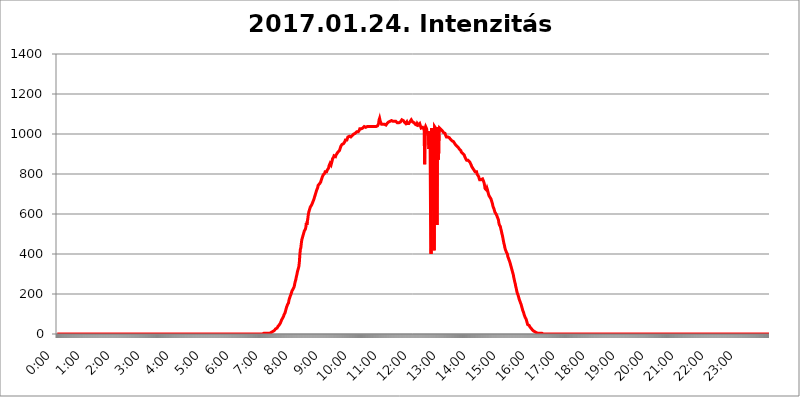
| Category | 2017.01.24. Intenzitás [W/m^2] |
|---|---|
| 0.0 | 0 |
| 0.0006944444444444445 | 0 |
| 0.001388888888888889 | 0 |
| 0.0020833333333333333 | 0 |
| 0.002777777777777778 | 0 |
| 0.003472222222222222 | 0 |
| 0.004166666666666667 | 0 |
| 0.004861111111111111 | 0 |
| 0.005555555555555556 | 0 |
| 0.0062499999999999995 | 0 |
| 0.006944444444444444 | 0 |
| 0.007638888888888889 | 0 |
| 0.008333333333333333 | 0 |
| 0.009027777777777779 | 0 |
| 0.009722222222222222 | 0 |
| 0.010416666666666666 | 0 |
| 0.011111111111111112 | 0 |
| 0.011805555555555555 | 0 |
| 0.012499999999999999 | 0 |
| 0.013194444444444444 | 0 |
| 0.013888888888888888 | 0 |
| 0.014583333333333332 | 0 |
| 0.015277777777777777 | 0 |
| 0.015972222222222224 | 0 |
| 0.016666666666666666 | 0 |
| 0.017361111111111112 | 0 |
| 0.018055555555555557 | 0 |
| 0.01875 | 0 |
| 0.019444444444444445 | 0 |
| 0.02013888888888889 | 0 |
| 0.020833333333333332 | 0 |
| 0.02152777777777778 | 0 |
| 0.022222222222222223 | 0 |
| 0.02291666666666667 | 0 |
| 0.02361111111111111 | 0 |
| 0.024305555555555556 | 0 |
| 0.024999999999999998 | 0 |
| 0.025694444444444447 | 0 |
| 0.02638888888888889 | 0 |
| 0.027083333333333334 | 0 |
| 0.027777777777777776 | 0 |
| 0.02847222222222222 | 0 |
| 0.029166666666666664 | 0 |
| 0.029861111111111113 | 0 |
| 0.030555555555555555 | 0 |
| 0.03125 | 0 |
| 0.03194444444444445 | 0 |
| 0.03263888888888889 | 0 |
| 0.03333333333333333 | 0 |
| 0.034027777777777775 | 0 |
| 0.034722222222222224 | 0 |
| 0.035416666666666666 | 0 |
| 0.036111111111111115 | 0 |
| 0.03680555555555556 | 0 |
| 0.0375 | 0 |
| 0.03819444444444444 | 0 |
| 0.03888888888888889 | 0 |
| 0.03958333333333333 | 0 |
| 0.04027777777777778 | 0 |
| 0.04097222222222222 | 0 |
| 0.041666666666666664 | 0 |
| 0.042361111111111106 | 0 |
| 0.04305555555555556 | 0 |
| 0.043750000000000004 | 0 |
| 0.044444444444444446 | 0 |
| 0.04513888888888889 | 0 |
| 0.04583333333333334 | 0 |
| 0.04652777777777778 | 0 |
| 0.04722222222222222 | 0 |
| 0.04791666666666666 | 0 |
| 0.04861111111111111 | 0 |
| 0.049305555555555554 | 0 |
| 0.049999999999999996 | 0 |
| 0.05069444444444445 | 0 |
| 0.051388888888888894 | 0 |
| 0.052083333333333336 | 0 |
| 0.05277777777777778 | 0 |
| 0.05347222222222222 | 0 |
| 0.05416666666666667 | 0 |
| 0.05486111111111111 | 0 |
| 0.05555555555555555 | 0 |
| 0.05625 | 0 |
| 0.05694444444444444 | 0 |
| 0.057638888888888885 | 0 |
| 0.05833333333333333 | 0 |
| 0.05902777777777778 | 0 |
| 0.059722222222222225 | 0 |
| 0.06041666666666667 | 0 |
| 0.061111111111111116 | 0 |
| 0.06180555555555556 | 0 |
| 0.0625 | 0 |
| 0.06319444444444444 | 0 |
| 0.06388888888888888 | 0 |
| 0.06458333333333334 | 0 |
| 0.06527777777777778 | 0 |
| 0.06597222222222222 | 0 |
| 0.06666666666666667 | 0 |
| 0.06736111111111111 | 0 |
| 0.06805555555555555 | 0 |
| 0.06874999999999999 | 0 |
| 0.06944444444444443 | 0 |
| 0.07013888888888889 | 0 |
| 0.07083333333333333 | 0 |
| 0.07152777777777779 | 0 |
| 0.07222222222222223 | 0 |
| 0.07291666666666667 | 0 |
| 0.07361111111111111 | 0 |
| 0.07430555555555556 | 0 |
| 0.075 | 0 |
| 0.07569444444444444 | 0 |
| 0.0763888888888889 | 0 |
| 0.07708333333333334 | 0 |
| 0.07777777777777778 | 0 |
| 0.07847222222222222 | 0 |
| 0.07916666666666666 | 0 |
| 0.0798611111111111 | 0 |
| 0.08055555555555556 | 0 |
| 0.08125 | 0 |
| 0.08194444444444444 | 0 |
| 0.08263888888888889 | 0 |
| 0.08333333333333333 | 0 |
| 0.08402777777777777 | 0 |
| 0.08472222222222221 | 0 |
| 0.08541666666666665 | 0 |
| 0.08611111111111112 | 0 |
| 0.08680555555555557 | 0 |
| 0.08750000000000001 | 0 |
| 0.08819444444444445 | 0 |
| 0.08888888888888889 | 0 |
| 0.08958333333333333 | 0 |
| 0.09027777777777778 | 0 |
| 0.09097222222222222 | 0 |
| 0.09166666666666667 | 0 |
| 0.09236111111111112 | 0 |
| 0.09305555555555556 | 0 |
| 0.09375 | 0 |
| 0.09444444444444444 | 0 |
| 0.09513888888888888 | 0 |
| 0.09583333333333333 | 0 |
| 0.09652777777777777 | 0 |
| 0.09722222222222222 | 0 |
| 0.09791666666666667 | 0 |
| 0.09861111111111111 | 0 |
| 0.09930555555555555 | 0 |
| 0.09999999999999999 | 0 |
| 0.10069444444444443 | 0 |
| 0.1013888888888889 | 0 |
| 0.10208333333333335 | 0 |
| 0.10277777777777779 | 0 |
| 0.10347222222222223 | 0 |
| 0.10416666666666667 | 0 |
| 0.10486111111111111 | 0 |
| 0.10555555555555556 | 0 |
| 0.10625 | 0 |
| 0.10694444444444444 | 0 |
| 0.1076388888888889 | 0 |
| 0.10833333333333334 | 0 |
| 0.10902777777777778 | 0 |
| 0.10972222222222222 | 0 |
| 0.1111111111111111 | 0 |
| 0.11180555555555556 | 0 |
| 0.11180555555555556 | 0 |
| 0.1125 | 0 |
| 0.11319444444444444 | 0 |
| 0.11388888888888889 | 0 |
| 0.11458333333333333 | 0 |
| 0.11527777777777777 | 0 |
| 0.11597222222222221 | 0 |
| 0.11666666666666665 | 0 |
| 0.1173611111111111 | 0 |
| 0.11805555555555557 | 0 |
| 0.11944444444444445 | 0 |
| 0.12013888888888889 | 0 |
| 0.12083333333333333 | 0 |
| 0.12152777777777778 | 0 |
| 0.12222222222222223 | 0 |
| 0.12291666666666667 | 0 |
| 0.12291666666666667 | 0 |
| 0.12361111111111112 | 0 |
| 0.12430555555555556 | 0 |
| 0.125 | 0 |
| 0.12569444444444444 | 0 |
| 0.12638888888888888 | 0 |
| 0.12708333333333333 | 0 |
| 0.16875 | 0 |
| 0.12847222222222224 | 0 |
| 0.12916666666666668 | 0 |
| 0.12986111111111112 | 0 |
| 0.13055555555555556 | 0 |
| 0.13125 | 0 |
| 0.13194444444444445 | 0 |
| 0.1326388888888889 | 0 |
| 0.13333333333333333 | 0 |
| 0.13402777777777777 | 0 |
| 0.13402777777777777 | 0 |
| 0.13472222222222222 | 0 |
| 0.13541666666666666 | 0 |
| 0.1361111111111111 | 0 |
| 0.13749999999999998 | 0 |
| 0.13819444444444443 | 0 |
| 0.1388888888888889 | 0 |
| 0.13958333333333334 | 0 |
| 0.14027777777777778 | 0 |
| 0.14097222222222222 | 0 |
| 0.14166666666666666 | 0 |
| 0.1423611111111111 | 0 |
| 0.14305555555555557 | 0 |
| 0.14375000000000002 | 0 |
| 0.14444444444444446 | 0 |
| 0.1451388888888889 | 0 |
| 0.1451388888888889 | 0 |
| 0.14652777777777778 | 0 |
| 0.14722222222222223 | 0 |
| 0.14791666666666667 | 0 |
| 0.1486111111111111 | 0 |
| 0.14930555555555555 | 0 |
| 0.15 | 0 |
| 0.15069444444444444 | 0 |
| 0.15138888888888888 | 0 |
| 0.15208333333333332 | 0 |
| 0.15277777777777776 | 0 |
| 0.15347222222222223 | 0 |
| 0.15416666666666667 | 0 |
| 0.15486111111111112 | 0 |
| 0.15555555555555556 | 0 |
| 0.15625 | 0 |
| 0.15694444444444444 | 0 |
| 0.15763888888888888 | 0 |
| 0.15833333333333333 | 0 |
| 0.15902777777777777 | 0 |
| 0.15972222222222224 | 0 |
| 0.16041666666666668 | 0 |
| 0.16111111111111112 | 0 |
| 0.16180555555555556 | 0 |
| 0.1625 | 0 |
| 0.16319444444444445 | 0 |
| 0.1638888888888889 | 0 |
| 0.16458333333333333 | 0 |
| 0.16527777777777777 | 0 |
| 0.16597222222222222 | 0 |
| 0.16666666666666666 | 0 |
| 0.1673611111111111 | 0 |
| 0.16805555555555554 | 0 |
| 0.16874999999999998 | 0 |
| 0.16944444444444443 | 0 |
| 0.17013888888888887 | 0 |
| 0.1708333333333333 | 0 |
| 0.17152777777777775 | 0 |
| 0.17222222222222225 | 0 |
| 0.1729166666666667 | 0 |
| 0.17361111111111113 | 0 |
| 0.17430555555555557 | 0 |
| 0.17500000000000002 | 0 |
| 0.17569444444444446 | 0 |
| 0.1763888888888889 | 0 |
| 0.17708333333333334 | 0 |
| 0.17777777777777778 | 0 |
| 0.17847222222222223 | 0 |
| 0.17916666666666667 | 0 |
| 0.1798611111111111 | 0 |
| 0.18055555555555555 | 0 |
| 0.18125 | 0 |
| 0.18194444444444444 | 0 |
| 0.1826388888888889 | 0 |
| 0.18333333333333335 | 0 |
| 0.1840277777777778 | 0 |
| 0.18472222222222223 | 0 |
| 0.18541666666666667 | 0 |
| 0.18611111111111112 | 0 |
| 0.18680555555555556 | 0 |
| 0.1875 | 0 |
| 0.18819444444444444 | 0 |
| 0.18888888888888888 | 0 |
| 0.18958333333333333 | 0 |
| 0.19027777777777777 | 0 |
| 0.1909722222222222 | 0 |
| 0.19166666666666665 | 0 |
| 0.19236111111111112 | 0 |
| 0.19305555555555554 | 0 |
| 0.19375 | 0 |
| 0.19444444444444445 | 0 |
| 0.1951388888888889 | 0 |
| 0.19583333333333333 | 0 |
| 0.19652777777777777 | 0 |
| 0.19722222222222222 | 0 |
| 0.19791666666666666 | 0 |
| 0.1986111111111111 | 0 |
| 0.19930555555555554 | 0 |
| 0.19999999999999998 | 0 |
| 0.20069444444444443 | 0 |
| 0.20138888888888887 | 0 |
| 0.2020833333333333 | 0 |
| 0.2027777777777778 | 0 |
| 0.2034722222222222 | 0 |
| 0.2041666666666667 | 0 |
| 0.20486111111111113 | 0 |
| 0.20555555555555557 | 0 |
| 0.20625000000000002 | 0 |
| 0.20694444444444446 | 0 |
| 0.2076388888888889 | 0 |
| 0.20833333333333334 | 0 |
| 0.20902777777777778 | 0 |
| 0.20972222222222223 | 0 |
| 0.21041666666666667 | 0 |
| 0.2111111111111111 | 0 |
| 0.21180555555555555 | 0 |
| 0.2125 | 0 |
| 0.21319444444444444 | 0 |
| 0.2138888888888889 | 0 |
| 0.21458333333333335 | 0 |
| 0.2152777777777778 | 0 |
| 0.21597222222222223 | 0 |
| 0.21666666666666667 | 0 |
| 0.21736111111111112 | 0 |
| 0.21805555555555556 | 0 |
| 0.21875 | 0 |
| 0.21944444444444444 | 0 |
| 0.22013888888888888 | 0 |
| 0.22083333333333333 | 0 |
| 0.22152777777777777 | 0 |
| 0.2222222222222222 | 0 |
| 0.22291666666666665 | 0 |
| 0.2236111111111111 | 0 |
| 0.22430555555555556 | 0 |
| 0.225 | 0 |
| 0.22569444444444445 | 0 |
| 0.2263888888888889 | 0 |
| 0.22708333333333333 | 0 |
| 0.22777777777777777 | 0 |
| 0.22847222222222222 | 0 |
| 0.22916666666666666 | 0 |
| 0.2298611111111111 | 0 |
| 0.23055555555555554 | 0 |
| 0.23124999999999998 | 0 |
| 0.23194444444444443 | 0 |
| 0.23263888888888887 | 0 |
| 0.2333333333333333 | 0 |
| 0.2340277777777778 | 0 |
| 0.2347222222222222 | 0 |
| 0.2354166666666667 | 0 |
| 0.23611111111111113 | 0 |
| 0.23680555555555557 | 0 |
| 0.23750000000000002 | 0 |
| 0.23819444444444446 | 0 |
| 0.2388888888888889 | 0 |
| 0.23958333333333334 | 0 |
| 0.24027777777777778 | 0 |
| 0.24097222222222223 | 0 |
| 0.24166666666666667 | 0 |
| 0.2423611111111111 | 0 |
| 0.24305555555555555 | 0 |
| 0.24375 | 0 |
| 0.24444444444444446 | 0 |
| 0.24513888888888888 | 0 |
| 0.24583333333333335 | 0 |
| 0.2465277777777778 | 0 |
| 0.24722222222222223 | 0 |
| 0.24791666666666667 | 0 |
| 0.24861111111111112 | 0 |
| 0.24930555555555556 | 0 |
| 0.25 | 0 |
| 0.25069444444444444 | 0 |
| 0.2513888888888889 | 0 |
| 0.2520833333333333 | 0 |
| 0.25277777777777777 | 0 |
| 0.2534722222222222 | 0 |
| 0.25416666666666665 | 0 |
| 0.2548611111111111 | 0 |
| 0.2555555555555556 | 0 |
| 0.25625000000000003 | 0 |
| 0.2569444444444445 | 0 |
| 0.2576388888888889 | 0 |
| 0.25833333333333336 | 0 |
| 0.2590277777777778 | 0 |
| 0.25972222222222224 | 0 |
| 0.2604166666666667 | 0 |
| 0.2611111111111111 | 0 |
| 0.26180555555555557 | 0 |
| 0.2625 | 0 |
| 0.26319444444444445 | 0 |
| 0.2638888888888889 | 0 |
| 0.26458333333333334 | 0 |
| 0.2652777777777778 | 0 |
| 0.2659722222222222 | 0 |
| 0.26666666666666666 | 0 |
| 0.2673611111111111 | 0 |
| 0.26805555555555555 | 0 |
| 0.26875 | 0 |
| 0.26944444444444443 | 0 |
| 0.2701388888888889 | 0 |
| 0.2708333333333333 | 0 |
| 0.27152777777777776 | 0 |
| 0.2722222222222222 | 0 |
| 0.27291666666666664 | 0 |
| 0.2736111111111111 | 0 |
| 0.2743055555555555 | 0 |
| 0.27499999999999997 | 0 |
| 0.27569444444444446 | 0 |
| 0.27638888888888885 | 0 |
| 0.27708333333333335 | 0 |
| 0.2777777777777778 | 0 |
| 0.27847222222222223 | 0 |
| 0.2791666666666667 | 0 |
| 0.2798611111111111 | 0 |
| 0.28055555555555556 | 0 |
| 0.28125 | 0 |
| 0.28194444444444444 | 0 |
| 0.2826388888888889 | 0 |
| 0.2833333333333333 | 0 |
| 0.28402777777777777 | 0 |
| 0.2847222222222222 | 0 |
| 0.28541666666666665 | 0 |
| 0.28611111111111115 | 0 |
| 0.28680555555555554 | 0 |
| 0.28750000000000003 | 0 |
| 0.2881944444444445 | 0 |
| 0.2888888888888889 | 0 |
| 0.28958333333333336 | 3.525 |
| 0.2902777777777778 | 0 |
| 0.29097222222222224 | 3.525 |
| 0.2916666666666667 | 3.525 |
| 0.2923611111111111 | 3.525 |
| 0.29305555555555557 | 3.525 |
| 0.29375 | 3.525 |
| 0.29444444444444445 | 3.525 |
| 0.2951388888888889 | 3.525 |
| 0.29583333333333334 | 3.525 |
| 0.2965277777777778 | 3.525 |
| 0.2972222222222222 | 3.525 |
| 0.29791666666666666 | 3.525 |
| 0.2986111111111111 | 7.887 |
| 0.29930555555555555 | 7.887 |
| 0.3 | 7.887 |
| 0.30069444444444443 | 12.257 |
| 0.3013888888888889 | 12.257 |
| 0.3020833333333333 | 12.257 |
| 0.30277777777777776 | 12.257 |
| 0.3034722222222222 | 16.636 |
| 0.30416666666666664 | 16.636 |
| 0.3048611111111111 | 21.024 |
| 0.3055555555555555 | 21.024 |
| 0.30624999999999997 | 25.419 |
| 0.3069444444444444 | 25.419 |
| 0.3076388888888889 | 29.823 |
| 0.30833333333333335 | 29.823 |
| 0.3090277777777778 | 29.823 |
| 0.30972222222222223 | 38.653 |
| 0.3104166666666667 | 38.653 |
| 0.3111111111111111 | 43.079 |
| 0.31180555555555556 | 47.511 |
| 0.3125 | 51.951 |
| 0.31319444444444444 | 56.398 |
| 0.3138888888888889 | 60.85 |
| 0.3145833333333333 | 69.775 |
| 0.31527777777777777 | 74.246 |
| 0.3159722222222222 | 78.722 |
| 0.31666666666666665 | 83.205 |
| 0.31736111111111115 | 87.692 |
| 0.31805555555555554 | 96.682 |
| 0.31875000000000003 | 101.184 |
| 0.3194444444444445 | 105.69 |
| 0.3201388888888889 | 110.201 |
| 0.32083333333333336 | 123.758 |
| 0.3215277777777778 | 132.814 |
| 0.32222222222222224 | 137.347 |
| 0.3229166666666667 | 146.423 |
| 0.3236111111111111 | 150.964 |
| 0.32430555555555557 | 155.509 |
| 0.325 | 169.156 |
| 0.32569444444444445 | 178.264 |
| 0.3263888888888889 | 182.82 |
| 0.32708333333333334 | 191.937 |
| 0.3277777777777778 | 196.497 |
| 0.3284722222222222 | 205.62 |
| 0.32916666666666666 | 214.746 |
| 0.3298611111111111 | 219.309 |
| 0.33055555555555555 | 223.873 |
| 0.33125 | 223.873 |
| 0.33194444444444443 | 233 |
| 0.3326388888888889 | 242.127 |
| 0.3333333333333333 | 255.813 |
| 0.3340277777777778 | 264.932 |
| 0.3347222222222222 | 274.047 |
| 0.3354166666666667 | 287.709 |
| 0.3361111111111111 | 296.808 |
| 0.3368055555555556 | 310.44 |
| 0.33749999999999997 | 314.98 |
| 0.33819444444444446 | 328.584 |
| 0.33888888888888885 | 337.639 |
| 0.33958333333333335 | 360.221 |
| 0.34027777777777773 | 396.164 |
| 0.34097222222222223 | 422.943 |
| 0.3416666666666666 | 431.833 |
| 0.3423611111111111 | 453.968 |
| 0.3430555555555555 | 471.582 |
| 0.34375 | 480.356 |
| 0.3444444444444445 | 489.108 |
| 0.3451388888888889 | 497.836 |
| 0.3458333333333334 | 506.542 |
| 0.34652777777777777 | 515.223 |
| 0.34722222222222227 | 515.223 |
| 0.34791666666666665 | 523.88 |
| 0.34861111111111115 | 532.513 |
| 0.34930555555555554 | 553.986 |
| 0.35000000000000003 | 545.416 |
| 0.3506944444444444 | 562.53 |
| 0.3513888888888889 | 575.299 |
| 0.3520833333333333 | 596.45 |
| 0.3527777777777778 | 609.062 |
| 0.3534722222222222 | 613.252 |
| 0.3541666666666667 | 625.784 |
| 0.3548611111111111 | 634.105 |
| 0.35555555555555557 | 634.105 |
| 0.35625 | 638.256 |
| 0.35694444444444445 | 646.537 |
| 0.3576388888888889 | 650.667 |
| 0.35833333333333334 | 658.909 |
| 0.3590277777777778 | 663.019 |
| 0.3597222222222222 | 671.22 |
| 0.36041666666666666 | 671.22 |
| 0.3611111111111111 | 687.544 |
| 0.36180555555555555 | 695.666 |
| 0.3625 | 703.762 |
| 0.36319444444444443 | 711.832 |
| 0.3638888888888889 | 719.877 |
| 0.3645833333333333 | 723.889 |
| 0.3652777777777778 | 731.896 |
| 0.3659722222222222 | 743.859 |
| 0.3666666666666667 | 747.834 |
| 0.3673611111111111 | 747.834 |
| 0.3680555555555556 | 751.803 |
| 0.36874999999999997 | 755.766 |
| 0.36944444444444446 | 759.723 |
| 0.37013888888888885 | 767.62 |
| 0.37083333333333335 | 771.559 |
| 0.37152777777777773 | 783.342 |
| 0.37222222222222223 | 783.342 |
| 0.3729166666666666 | 795.074 |
| 0.3736111111111111 | 795.074 |
| 0.3743055555555555 | 795.074 |
| 0.375 | 802.868 |
| 0.3756944444444445 | 810.641 |
| 0.3763888888888889 | 810.641 |
| 0.3770833333333334 | 810.641 |
| 0.37777777777777777 | 810.641 |
| 0.37847222222222227 | 818.392 |
| 0.37916666666666665 | 818.392 |
| 0.37986111111111115 | 822.26 |
| 0.38055555555555554 | 829.981 |
| 0.38125000000000003 | 841.526 |
| 0.3819444444444444 | 841.526 |
| 0.3826388888888889 | 853.029 |
| 0.3833333333333333 | 853.029 |
| 0.3840277777777778 | 845.365 |
| 0.3847222222222222 | 849.199 |
| 0.3854166666666667 | 864.493 |
| 0.3861111111111111 | 875.918 |
| 0.38680555555555557 | 875.918 |
| 0.3875 | 883.516 |
| 0.38819444444444445 | 891.099 |
| 0.3888888888888889 | 891.099 |
| 0.38958333333333334 | 887.309 |
| 0.3902777777777778 | 887.309 |
| 0.3909722222222222 | 894.885 |
| 0.39166666666666666 | 898.668 |
| 0.3923611111111111 | 902.447 |
| 0.39305555555555555 | 906.223 |
| 0.39375 | 909.996 |
| 0.39444444444444443 | 909.996 |
| 0.3951388888888889 | 909.996 |
| 0.3958333333333333 | 917.534 |
| 0.3965277777777778 | 921.298 |
| 0.3972222222222222 | 932.576 |
| 0.3979166666666667 | 940.082 |
| 0.3986111111111111 | 940.082 |
| 0.3993055555555556 | 947.58 |
| 0.39999999999999997 | 943.832 |
| 0.40069444444444446 | 943.832 |
| 0.40138888888888885 | 951.327 |
| 0.40208333333333335 | 955.071 |
| 0.40277777777777773 | 955.071 |
| 0.40347222222222223 | 962.555 |
| 0.4041666666666666 | 970.034 |
| 0.4048611111111111 | 966.295 |
| 0.4055555555555555 | 966.295 |
| 0.40625 | 970.034 |
| 0.4069444444444445 | 977.508 |
| 0.4076388888888889 | 984.98 |
| 0.4083333333333334 | 984.98 |
| 0.40902777777777777 | 988.714 |
| 0.40972222222222227 | 988.714 |
| 0.41041666666666665 | 984.98 |
| 0.41111111111111115 | 984.98 |
| 0.41180555555555554 | 984.98 |
| 0.41250000000000003 | 988.714 |
| 0.4131944444444444 | 988.714 |
| 0.4138888888888889 | 992.448 |
| 0.4145833333333333 | 992.448 |
| 0.4152777777777778 | 996.182 |
| 0.4159722222222222 | 999.916 |
| 0.4166666666666667 | 999.916 |
| 0.4173611111111111 | 1003.65 |
| 0.41805555555555557 | 1003.65 |
| 0.41875 | 1003.65 |
| 0.41944444444444445 | 1007.383 |
| 0.4201388888888889 | 1011.118 |
| 0.42083333333333334 | 1011.118 |
| 0.4215277777777778 | 1014.852 |
| 0.4222222222222222 | 1011.118 |
| 0.42291666666666666 | 1014.852 |
| 0.4236111111111111 | 1018.587 |
| 0.42430555555555555 | 1026.06 |
| 0.425 | 1029.798 |
| 0.42569444444444443 | 1029.798 |
| 0.4263888888888889 | 1026.06 |
| 0.4270833333333333 | 1029.798 |
| 0.4277777777777778 | 1029.798 |
| 0.4284722222222222 | 1029.798 |
| 0.4291666666666667 | 1029.798 |
| 0.4298611111111111 | 1029.798 |
| 0.4305555555555556 | 1037.277 |
| 0.43124999999999997 | 1037.277 |
| 0.43194444444444446 | 1033.537 |
| 0.43263888888888885 | 1033.537 |
| 0.43333333333333335 | 1037.277 |
| 0.43402777777777773 | 1037.277 |
| 0.43472222222222223 | 1037.277 |
| 0.4354166666666666 | 1037.277 |
| 0.4361111111111111 | 1037.277 |
| 0.4368055555555555 | 1037.277 |
| 0.4375 | 1041.019 |
| 0.4381944444444445 | 1037.277 |
| 0.4388888888888889 | 1037.277 |
| 0.4395833333333334 | 1041.019 |
| 0.44027777777777777 | 1041.019 |
| 0.44097222222222227 | 1037.277 |
| 0.44166666666666665 | 1041.019 |
| 0.44236111111111115 | 1037.277 |
| 0.44305555555555554 | 1037.277 |
| 0.44375000000000003 | 1037.277 |
| 0.4444444444444444 | 1041.019 |
| 0.4451388888888889 | 1037.277 |
| 0.4458333333333333 | 1037.277 |
| 0.4465277777777778 | 1041.019 |
| 0.4472222222222222 | 1037.277 |
| 0.4479166666666667 | 1041.019 |
| 0.4486111111111111 | 1041.019 |
| 0.44930555555555557 | 1041.019 |
| 0.45 | 1044.762 |
| 0.45069444444444445 | 1052.255 |
| 0.4513888888888889 | 1071.027 |
| 0.45208333333333334 | 1078.555 |
| 0.4527777777777778 | 1067.267 |
| 0.4534722222222222 | 1059.756 |
| 0.45416666666666666 | 1056.004 |
| 0.4548611111111111 | 1048.508 |
| 0.45555555555555555 | 1048.508 |
| 0.45625 | 1052.255 |
| 0.45694444444444443 | 1048.508 |
| 0.4576388888888889 | 1052.255 |
| 0.4583333333333333 | 1052.255 |
| 0.4590277777777778 | 1048.508 |
| 0.4597222222222222 | 1048.508 |
| 0.4604166666666667 | 1048.508 |
| 0.4611111111111111 | 1044.762 |
| 0.4618055555555556 | 1048.508 |
| 0.46249999999999997 | 1052.255 |
| 0.46319444444444446 | 1052.255 |
| 0.46388888888888885 | 1056.004 |
| 0.46458333333333335 | 1059.756 |
| 0.46527777777777773 | 1059.756 |
| 0.46597222222222223 | 1059.756 |
| 0.4666666666666666 | 1063.51 |
| 0.4673611111111111 | 1063.51 |
| 0.4680555555555555 | 1063.51 |
| 0.46875 | 1067.267 |
| 0.4694444444444445 | 1067.267 |
| 0.4701388888888889 | 1067.267 |
| 0.4708333333333334 | 1063.51 |
| 0.47152777777777777 | 1059.756 |
| 0.47222222222222227 | 1067.267 |
| 0.47291666666666665 | 1063.51 |
| 0.47361111111111115 | 1059.756 |
| 0.47430555555555554 | 1063.51 |
| 0.47500000000000003 | 1063.51 |
| 0.4756944444444444 | 1067.267 |
| 0.4763888888888889 | 1059.756 |
| 0.4770833333333333 | 1056.004 |
| 0.4777777777777778 | 1056.004 |
| 0.4784722222222222 | 1059.756 |
| 0.4791666666666667 | 1056.004 |
| 0.4798611111111111 | 1052.255 |
| 0.48055555555555557 | 1056.004 |
| 0.48125 | 1059.756 |
| 0.48194444444444445 | 1059.756 |
| 0.4826388888888889 | 1063.51 |
| 0.48333333333333334 | 1071.027 |
| 0.4840277777777778 | 1067.267 |
| 0.4847222222222222 | 1067.267 |
| 0.48541666666666666 | 1067.267 |
| 0.4861111111111111 | 1067.267 |
| 0.48680555555555555 | 1059.756 |
| 0.4875 | 1056.004 |
| 0.48819444444444443 | 1056.004 |
| 0.4888888888888889 | 1052.255 |
| 0.4895833333333333 | 1056.004 |
| 0.4902777777777778 | 1059.756 |
| 0.4909722222222222 | 1052.255 |
| 0.4916666666666667 | 1056.004 |
| 0.4923611111111111 | 1048.508 |
| 0.4930555555555556 | 1052.255 |
| 0.49374999999999997 | 1056.004 |
| 0.49444444444444446 | 1059.756 |
| 0.49513888888888885 | 1063.51 |
| 0.49583333333333335 | 1059.756 |
| 0.49652777777777773 | 1071.027 |
| 0.49722222222222223 | 1067.267 |
| 0.4979166666666666 | 1067.267 |
| 0.4986111111111111 | 1059.756 |
| 0.4993055555555555 | 1063.51 |
| 0.5 | 1059.756 |
| 0.5006944444444444 | 1056.004 |
| 0.5013888888888889 | 1052.255 |
| 0.5020833333333333 | 1048.508 |
| 0.5027777777777778 | 1052.255 |
| 0.5034722222222222 | 1044.762 |
| 0.5041666666666667 | 1044.762 |
| 0.5048611111111111 | 1052.255 |
| 0.5055555555555555 | 1052.255 |
| 0.50625 | 1044.762 |
| 0.5069444444444444 | 1041.019 |
| 0.5076388888888889 | 1048.508 |
| 0.5083333333333333 | 1052.255 |
| 0.5090277777777777 | 1044.762 |
| 0.5097222222222222 | 1044.762 |
| 0.5104166666666666 | 1029.798 |
| 0.5111111111111112 | 1029.798 |
| 0.5118055555555555 | 1029.798 |
| 0.5125000000000001 | 1033.537 |
| 0.5131944444444444 | 1029.798 |
| 0.513888888888889 | 1026.06 |
| 0.5145833333333333 | 1018.587 |
| 0.5152777777777778 | 849.199 |
| 0.5159722222222222 | 1029.798 |
| 0.5166666666666667 | 1037.277 |
| 0.517361111111111 | 1037.277 |
| 0.5180555555555556 | 1026.06 |
| 0.5187499999999999 | 1007.383 |
| 0.5194444444444445 | 999.916 |
| 0.5201388888888888 | 1014.852 |
| 0.5208333333333334 | 1014.852 |
| 0.5215277777777778 | 925.06 |
| 0.5222222222222223 | 1007.383 |
| 0.5229166666666667 | 970.034 |
| 0.5236111111111111 | 571.049 |
| 0.5243055555555556 | 400.638 |
| 0.525 | 1029.798 |
| 0.5256944444444445 | 617.436 |
| 0.5263888888888889 | 973.772 |
| 0.5270833333333333 | 966.295 |
| 0.5277777777777778 | 1029.798 |
| 0.5284722222222222 | 418.492 |
| 0.5291666666666667 | 1037.277 |
| 0.5298611111111111 | 1033.537 |
| 0.5305555555555556 | 1029.798 |
| 0.53125 | 1011.118 |
| 0.5319444444444444 | 806.757 |
| 0.5326388888888889 | 545.416 |
| 0.5333333333333333 | 1014.852 |
| 0.5340277777777778 | 1033.537 |
| 0.5347222222222222 | 872.114 |
| 0.5354166666666667 | 996.182 |
| 0.5361111111111111 | 1029.798 |
| 0.5368055555555555 | 1026.06 |
| 0.5375 | 1026.06 |
| 0.5381944444444444 | 1022.323 |
| 0.5388888888888889 | 1018.587 |
| 0.5395833333333333 | 1018.587 |
| 0.5402777777777777 | 1014.852 |
| 0.5409722222222222 | 1011.118 |
| 0.5416666666666666 | 1007.383 |
| 0.5423611111111112 | 1007.383 |
| 0.5430555555555555 | 1003.65 |
| 0.5437500000000001 | 1003.65 |
| 0.5444444444444444 | 996.182 |
| 0.545138888888889 | 992.448 |
| 0.5458333333333333 | 984.98 |
| 0.5465277777777778 | 988.714 |
| 0.5472222222222222 | 988.714 |
| 0.5479166666666667 | 984.98 |
| 0.548611111111111 | 984.98 |
| 0.5493055555555556 | 984.98 |
| 0.5499999999999999 | 981.244 |
| 0.5506944444444445 | 977.508 |
| 0.5513888888888888 | 973.772 |
| 0.5520833333333334 | 970.034 |
| 0.5527777777777778 | 970.034 |
| 0.5534722222222223 | 966.295 |
| 0.5541666666666667 | 962.555 |
| 0.5548611111111111 | 966.295 |
| 0.5555555555555556 | 962.555 |
| 0.55625 | 958.814 |
| 0.5569444444444445 | 955.071 |
| 0.5576388888888889 | 951.327 |
| 0.5583333333333333 | 947.58 |
| 0.5590277777777778 | 943.832 |
| 0.5597222222222222 | 943.832 |
| 0.5604166666666667 | 940.082 |
| 0.5611111111111111 | 936.33 |
| 0.5618055555555556 | 936.33 |
| 0.5625 | 932.576 |
| 0.5631944444444444 | 928.819 |
| 0.5638888888888889 | 925.06 |
| 0.5645833333333333 | 921.298 |
| 0.5652777777777778 | 921.298 |
| 0.5659722222222222 | 917.534 |
| 0.5666666666666667 | 909.996 |
| 0.5673611111111111 | 906.223 |
| 0.5680555555555555 | 906.223 |
| 0.56875 | 902.447 |
| 0.5694444444444444 | 898.668 |
| 0.5701388888888889 | 898.668 |
| 0.5708333333333333 | 894.885 |
| 0.5715277777777777 | 887.309 |
| 0.5722222222222222 | 883.516 |
| 0.5729166666666666 | 875.918 |
| 0.5736111111111112 | 872.114 |
| 0.5743055555555555 | 868.305 |
| 0.5750000000000001 | 872.114 |
| 0.5756944444444444 | 868.305 |
| 0.576388888888889 | 868.305 |
| 0.5770833333333333 | 864.493 |
| 0.5777777777777778 | 864.493 |
| 0.5784722222222222 | 860.676 |
| 0.5791666666666667 | 860.676 |
| 0.579861111111111 | 856.855 |
| 0.5805555555555556 | 845.365 |
| 0.5812499999999999 | 837.682 |
| 0.5819444444444445 | 837.682 |
| 0.5826388888888888 | 829.981 |
| 0.5833333333333334 | 826.123 |
| 0.5840277777777778 | 822.26 |
| 0.5847222222222223 | 826.123 |
| 0.5854166666666667 | 818.392 |
| 0.5861111111111111 | 810.641 |
| 0.5868055555555556 | 810.641 |
| 0.5875 | 810.641 |
| 0.5881944444444445 | 810.641 |
| 0.5888888888888889 | 798.974 |
| 0.5895833333333333 | 798.974 |
| 0.5902777777777778 | 795.074 |
| 0.5909722222222222 | 787.258 |
| 0.5916666666666667 | 783.342 |
| 0.5923611111111111 | 771.559 |
| 0.5930555555555556 | 771.559 |
| 0.59375 | 775.492 |
| 0.5944444444444444 | 771.559 |
| 0.5951388888888889 | 771.559 |
| 0.5958333333333333 | 775.492 |
| 0.5965277777777778 | 775.492 |
| 0.5972222222222222 | 771.559 |
| 0.5979166666666667 | 763.674 |
| 0.5986111111111111 | 755.766 |
| 0.5993055555555555 | 743.859 |
| 0.6 | 727.896 |
| 0.6006944444444444 | 723.889 |
| 0.6013888888888889 | 723.889 |
| 0.6020833333333333 | 719.877 |
| 0.6027777777777777 | 727.896 |
| 0.6034722222222222 | 719.877 |
| 0.6041666666666666 | 707.8 |
| 0.6048611111111112 | 699.717 |
| 0.6055555555555555 | 691.608 |
| 0.6062500000000001 | 687.544 |
| 0.6069444444444444 | 683.473 |
| 0.607638888888889 | 679.395 |
| 0.6083333333333333 | 675.311 |
| 0.6090277777777778 | 671.22 |
| 0.6097222222222222 | 658.909 |
| 0.6104166666666667 | 650.667 |
| 0.611111111111111 | 638.256 |
| 0.6118055555555556 | 638.256 |
| 0.6124999999999999 | 625.784 |
| 0.6131944444444445 | 617.436 |
| 0.6138888888888888 | 609.062 |
| 0.6145833333333334 | 609.062 |
| 0.6152777777777778 | 604.864 |
| 0.6159722222222223 | 596.45 |
| 0.6166666666666667 | 596.45 |
| 0.6173611111111111 | 583.779 |
| 0.6180555555555556 | 583.779 |
| 0.61875 | 571.049 |
| 0.6194444444444445 | 553.986 |
| 0.6201388888888889 | 545.416 |
| 0.6208333333333333 | 541.121 |
| 0.6215277777777778 | 536.82 |
| 0.6222222222222222 | 523.88 |
| 0.6229166666666667 | 515.223 |
| 0.6236111111111111 | 502.192 |
| 0.6243055555555556 | 493.475 |
| 0.625 | 480.356 |
| 0.6256944444444444 | 467.187 |
| 0.6263888888888889 | 453.968 |
| 0.6270833333333333 | 445.129 |
| 0.6277777777777778 | 431.833 |
| 0.6284722222222222 | 422.943 |
| 0.6291666666666667 | 418.492 |
| 0.6298611111111111 | 409.574 |
| 0.6305555555555555 | 405.108 |
| 0.63125 | 400.638 |
| 0.6319444444444444 | 387.202 |
| 0.6326388888888889 | 382.715 |
| 0.6333333333333333 | 373.729 |
| 0.6340277777777777 | 369.23 |
| 0.6347222222222222 | 360.221 |
| 0.6354166666666666 | 351.198 |
| 0.6361111111111112 | 342.162 |
| 0.6368055555555555 | 333.113 |
| 0.6375000000000001 | 324.052 |
| 0.6381944444444444 | 314.98 |
| 0.638888888888889 | 305.898 |
| 0.6395833333333333 | 296.808 |
| 0.6402777777777778 | 283.156 |
| 0.6409722222222222 | 278.603 |
| 0.6416666666666667 | 260.373 |
| 0.642361111111111 | 251.251 |
| 0.6430555555555556 | 237.564 |
| 0.6437499999999999 | 228.436 |
| 0.6444444444444445 | 214.746 |
| 0.6451388888888888 | 205.62 |
| 0.6458333333333334 | 201.058 |
| 0.6465277777777778 | 191.937 |
| 0.6472222222222223 | 182.82 |
| 0.6479166666666667 | 173.709 |
| 0.6486111111111111 | 169.156 |
| 0.6493055555555556 | 160.056 |
| 0.65 | 155.509 |
| 0.6506944444444445 | 146.423 |
| 0.6513888888888889 | 141.884 |
| 0.6520833333333333 | 128.284 |
| 0.6527777777777778 | 119.235 |
| 0.6534722222222222 | 114.716 |
| 0.6541666666666667 | 105.69 |
| 0.6548611111111111 | 96.682 |
| 0.6555555555555556 | 92.184 |
| 0.65625 | 83.205 |
| 0.6569444444444444 | 78.722 |
| 0.6576388888888889 | 74.246 |
| 0.6583333333333333 | 69.775 |
| 0.6590277777777778 | 56.398 |
| 0.6597222222222222 | 47.511 |
| 0.6604166666666667 | 47.511 |
| 0.6611111111111111 | 47.511 |
| 0.6618055555555555 | 43.079 |
| 0.6625 | 38.653 |
| 0.6631944444444444 | 34.234 |
| 0.6638888888888889 | 29.823 |
| 0.6645833333333333 | 29.823 |
| 0.6652777777777777 | 25.419 |
| 0.6659722222222222 | 21.024 |
| 0.6666666666666666 | 21.024 |
| 0.6673611111111111 | 16.636 |
| 0.6680555555555556 | 16.636 |
| 0.6687500000000001 | 12.257 |
| 0.6694444444444444 | 12.257 |
| 0.6701388888888888 | 7.887 |
| 0.6708333333333334 | 7.887 |
| 0.6715277777777778 | 7.887 |
| 0.6722222222222222 | 3.525 |
| 0.6729166666666666 | 3.525 |
| 0.6736111111111112 | 3.525 |
| 0.6743055555555556 | 3.525 |
| 0.6749999999999999 | 3.525 |
| 0.6756944444444444 | 3.525 |
| 0.6763888888888889 | 3.525 |
| 0.6770833333333334 | 3.525 |
| 0.6777777777777777 | 3.525 |
| 0.6784722222222223 | 3.525 |
| 0.6791666666666667 | 3.525 |
| 0.6798611111111111 | 3.525 |
| 0.6805555555555555 | 0 |
| 0.68125 | 0 |
| 0.6819444444444445 | 0 |
| 0.6826388888888889 | 0 |
| 0.6833333333333332 | 0 |
| 0.6840277777777778 | 0 |
| 0.6847222222222222 | 0 |
| 0.6854166666666667 | 0 |
| 0.686111111111111 | 0 |
| 0.6868055555555556 | 0 |
| 0.6875 | 0 |
| 0.6881944444444444 | 0 |
| 0.688888888888889 | 0 |
| 0.6895833333333333 | 0 |
| 0.6902777777777778 | 0 |
| 0.6909722222222222 | 0 |
| 0.6916666666666668 | 0 |
| 0.6923611111111111 | 0 |
| 0.6930555555555555 | 0 |
| 0.69375 | 0 |
| 0.6944444444444445 | 0 |
| 0.6951388888888889 | 0 |
| 0.6958333333333333 | 0 |
| 0.6965277777777777 | 0 |
| 0.6972222222222223 | 0 |
| 0.6979166666666666 | 0 |
| 0.6986111111111111 | 0 |
| 0.6993055555555556 | 0 |
| 0.7000000000000001 | 0 |
| 0.7006944444444444 | 0 |
| 0.7013888888888888 | 0 |
| 0.7020833333333334 | 0 |
| 0.7027777777777778 | 0 |
| 0.7034722222222222 | 0 |
| 0.7041666666666666 | 0 |
| 0.7048611111111112 | 0 |
| 0.7055555555555556 | 0 |
| 0.7062499999999999 | 0 |
| 0.7069444444444444 | 0 |
| 0.7076388888888889 | 0 |
| 0.7083333333333334 | 0 |
| 0.7090277777777777 | 0 |
| 0.7097222222222223 | 0 |
| 0.7104166666666667 | 0 |
| 0.7111111111111111 | 0 |
| 0.7118055555555555 | 0 |
| 0.7125 | 0 |
| 0.7131944444444445 | 0 |
| 0.7138888888888889 | 0 |
| 0.7145833333333332 | 0 |
| 0.7152777777777778 | 0 |
| 0.7159722222222222 | 0 |
| 0.7166666666666667 | 0 |
| 0.717361111111111 | 0 |
| 0.7180555555555556 | 0 |
| 0.71875 | 0 |
| 0.7194444444444444 | 0 |
| 0.720138888888889 | 0 |
| 0.7208333333333333 | 0 |
| 0.7215277777777778 | 0 |
| 0.7222222222222222 | 0 |
| 0.7229166666666668 | 0 |
| 0.7236111111111111 | 0 |
| 0.7243055555555555 | 0 |
| 0.725 | 0 |
| 0.7256944444444445 | 0 |
| 0.7263888888888889 | 0 |
| 0.7270833333333333 | 0 |
| 0.7277777777777777 | 0 |
| 0.7284722222222223 | 0 |
| 0.7291666666666666 | 0 |
| 0.7298611111111111 | 0 |
| 0.7305555555555556 | 0 |
| 0.7312500000000001 | 0 |
| 0.7319444444444444 | 0 |
| 0.7326388888888888 | 0 |
| 0.7333333333333334 | 0 |
| 0.7340277777777778 | 0 |
| 0.7347222222222222 | 0 |
| 0.7354166666666666 | 0 |
| 0.7361111111111112 | 0 |
| 0.7368055555555556 | 0 |
| 0.7374999999999999 | 0 |
| 0.7381944444444444 | 0 |
| 0.7388888888888889 | 0 |
| 0.7395833333333334 | 0 |
| 0.7402777777777777 | 0 |
| 0.7409722222222223 | 0 |
| 0.7416666666666667 | 0 |
| 0.7423611111111111 | 0 |
| 0.7430555555555555 | 0 |
| 0.74375 | 0 |
| 0.7444444444444445 | 0 |
| 0.7451388888888889 | 0 |
| 0.7458333333333332 | 0 |
| 0.7465277777777778 | 0 |
| 0.7472222222222222 | 0 |
| 0.7479166666666667 | 0 |
| 0.748611111111111 | 0 |
| 0.7493055555555556 | 0 |
| 0.75 | 0 |
| 0.7506944444444444 | 0 |
| 0.751388888888889 | 0 |
| 0.7520833333333333 | 0 |
| 0.7527777777777778 | 0 |
| 0.7534722222222222 | 0 |
| 0.7541666666666668 | 0 |
| 0.7548611111111111 | 0 |
| 0.7555555555555555 | 0 |
| 0.75625 | 0 |
| 0.7569444444444445 | 0 |
| 0.7576388888888889 | 0 |
| 0.7583333333333333 | 0 |
| 0.7590277777777777 | 0 |
| 0.7597222222222223 | 0 |
| 0.7604166666666666 | 0 |
| 0.7611111111111111 | 0 |
| 0.7618055555555556 | 0 |
| 0.7625000000000001 | 0 |
| 0.7631944444444444 | 0 |
| 0.7638888888888888 | 0 |
| 0.7645833333333334 | 0 |
| 0.7652777777777778 | 0 |
| 0.7659722222222222 | 0 |
| 0.7666666666666666 | 0 |
| 0.7673611111111112 | 0 |
| 0.7680555555555556 | 0 |
| 0.7687499999999999 | 0 |
| 0.7694444444444444 | 0 |
| 0.7701388888888889 | 0 |
| 0.7708333333333334 | 0 |
| 0.7715277777777777 | 0 |
| 0.7722222222222223 | 0 |
| 0.7729166666666667 | 0 |
| 0.7736111111111111 | 0 |
| 0.7743055555555555 | 0 |
| 0.775 | 0 |
| 0.7756944444444445 | 0 |
| 0.7763888888888889 | 0 |
| 0.7770833333333332 | 0 |
| 0.7777777777777778 | 0 |
| 0.7784722222222222 | 0 |
| 0.7791666666666667 | 0 |
| 0.779861111111111 | 0 |
| 0.7805555555555556 | 0 |
| 0.78125 | 0 |
| 0.7819444444444444 | 0 |
| 0.782638888888889 | 0 |
| 0.7833333333333333 | 0 |
| 0.7840277777777778 | 0 |
| 0.7847222222222222 | 0 |
| 0.7854166666666668 | 0 |
| 0.7861111111111111 | 0 |
| 0.7868055555555555 | 0 |
| 0.7875 | 0 |
| 0.7881944444444445 | 0 |
| 0.7888888888888889 | 0 |
| 0.7895833333333333 | 0 |
| 0.7902777777777777 | 0 |
| 0.7909722222222223 | 0 |
| 0.7916666666666666 | 0 |
| 0.7923611111111111 | 0 |
| 0.7930555555555556 | 0 |
| 0.7937500000000001 | 0 |
| 0.7944444444444444 | 0 |
| 0.7951388888888888 | 0 |
| 0.7958333333333334 | 0 |
| 0.7965277777777778 | 0 |
| 0.7972222222222222 | 0 |
| 0.7979166666666666 | 0 |
| 0.7986111111111112 | 0 |
| 0.7993055555555556 | 0 |
| 0.7999999999999999 | 0 |
| 0.8006944444444444 | 0 |
| 0.8013888888888889 | 0 |
| 0.8020833333333334 | 0 |
| 0.8027777777777777 | 0 |
| 0.8034722222222223 | 0 |
| 0.8041666666666667 | 0 |
| 0.8048611111111111 | 0 |
| 0.8055555555555555 | 0 |
| 0.80625 | 0 |
| 0.8069444444444445 | 0 |
| 0.8076388888888889 | 0 |
| 0.8083333333333332 | 0 |
| 0.8090277777777778 | 0 |
| 0.8097222222222222 | 0 |
| 0.8104166666666667 | 0 |
| 0.811111111111111 | 0 |
| 0.8118055555555556 | 0 |
| 0.8125 | 0 |
| 0.8131944444444444 | 0 |
| 0.813888888888889 | 0 |
| 0.8145833333333333 | 0 |
| 0.8152777777777778 | 0 |
| 0.8159722222222222 | 0 |
| 0.8166666666666668 | 0 |
| 0.8173611111111111 | 0 |
| 0.8180555555555555 | 0 |
| 0.81875 | 0 |
| 0.8194444444444445 | 0 |
| 0.8201388888888889 | 0 |
| 0.8208333333333333 | 0 |
| 0.8215277777777777 | 0 |
| 0.8222222222222223 | 0 |
| 0.8229166666666666 | 0 |
| 0.8236111111111111 | 0 |
| 0.8243055555555556 | 0 |
| 0.8250000000000001 | 0 |
| 0.8256944444444444 | 0 |
| 0.8263888888888888 | 0 |
| 0.8270833333333334 | 0 |
| 0.8277777777777778 | 0 |
| 0.8284722222222222 | 0 |
| 0.8291666666666666 | 0 |
| 0.8298611111111112 | 0 |
| 0.8305555555555556 | 0 |
| 0.8312499999999999 | 0 |
| 0.8319444444444444 | 0 |
| 0.8326388888888889 | 0 |
| 0.8333333333333334 | 0 |
| 0.8340277777777777 | 0 |
| 0.8347222222222223 | 0 |
| 0.8354166666666667 | 0 |
| 0.8361111111111111 | 0 |
| 0.8368055555555555 | 0 |
| 0.8375 | 0 |
| 0.8381944444444445 | 0 |
| 0.8388888888888889 | 0 |
| 0.8395833333333332 | 0 |
| 0.8402777777777778 | 0 |
| 0.8409722222222222 | 0 |
| 0.8416666666666667 | 0 |
| 0.842361111111111 | 0 |
| 0.8430555555555556 | 0 |
| 0.84375 | 0 |
| 0.8444444444444444 | 0 |
| 0.845138888888889 | 0 |
| 0.8458333333333333 | 0 |
| 0.8465277777777778 | 0 |
| 0.8472222222222222 | 0 |
| 0.8479166666666668 | 0 |
| 0.8486111111111111 | 0 |
| 0.8493055555555555 | 0 |
| 0.85 | 0 |
| 0.8506944444444445 | 0 |
| 0.8513888888888889 | 0 |
| 0.8520833333333333 | 0 |
| 0.8527777777777777 | 0 |
| 0.8534722222222223 | 0 |
| 0.8541666666666666 | 0 |
| 0.8548611111111111 | 0 |
| 0.8555555555555556 | 0 |
| 0.8562500000000001 | 0 |
| 0.8569444444444444 | 0 |
| 0.8576388888888888 | 0 |
| 0.8583333333333334 | 0 |
| 0.8590277777777778 | 0 |
| 0.8597222222222222 | 0 |
| 0.8604166666666666 | 0 |
| 0.8611111111111112 | 0 |
| 0.8618055555555556 | 0 |
| 0.8624999999999999 | 0 |
| 0.8631944444444444 | 0 |
| 0.8638888888888889 | 0 |
| 0.8645833333333334 | 0 |
| 0.8652777777777777 | 0 |
| 0.8659722222222223 | 0 |
| 0.8666666666666667 | 0 |
| 0.8673611111111111 | 0 |
| 0.8680555555555555 | 0 |
| 0.86875 | 0 |
| 0.8694444444444445 | 0 |
| 0.8701388888888889 | 0 |
| 0.8708333333333332 | 0 |
| 0.8715277777777778 | 0 |
| 0.8722222222222222 | 0 |
| 0.8729166666666667 | 0 |
| 0.873611111111111 | 0 |
| 0.8743055555555556 | 0 |
| 0.875 | 0 |
| 0.8756944444444444 | 0 |
| 0.876388888888889 | 0 |
| 0.8770833333333333 | 0 |
| 0.8777777777777778 | 0 |
| 0.8784722222222222 | 0 |
| 0.8791666666666668 | 0 |
| 0.8798611111111111 | 0 |
| 0.8805555555555555 | 0 |
| 0.88125 | 0 |
| 0.8819444444444445 | 0 |
| 0.8826388888888889 | 0 |
| 0.8833333333333333 | 0 |
| 0.8840277777777777 | 0 |
| 0.8847222222222223 | 0 |
| 0.8854166666666666 | 0 |
| 0.8861111111111111 | 0 |
| 0.8868055555555556 | 0 |
| 0.8875000000000001 | 0 |
| 0.8881944444444444 | 0 |
| 0.8888888888888888 | 0 |
| 0.8895833333333334 | 0 |
| 0.8902777777777778 | 0 |
| 0.8909722222222222 | 0 |
| 0.8916666666666666 | 0 |
| 0.8923611111111112 | 0 |
| 0.8930555555555556 | 0 |
| 0.8937499999999999 | 0 |
| 0.8944444444444444 | 0 |
| 0.8951388888888889 | 0 |
| 0.8958333333333334 | 0 |
| 0.8965277777777777 | 0 |
| 0.8972222222222223 | 0 |
| 0.8979166666666667 | 0 |
| 0.8986111111111111 | 0 |
| 0.8993055555555555 | 0 |
| 0.9 | 0 |
| 0.9006944444444445 | 0 |
| 0.9013888888888889 | 0 |
| 0.9020833333333332 | 0 |
| 0.9027777777777778 | 0 |
| 0.9034722222222222 | 0 |
| 0.9041666666666667 | 0 |
| 0.904861111111111 | 0 |
| 0.9055555555555556 | 0 |
| 0.90625 | 0 |
| 0.9069444444444444 | 0 |
| 0.907638888888889 | 0 |
| 0.9083333333333333 | 0 |
| 0.9090277777777778 | 0 |
| 0.9097222222222222 | 0 |
| 0.9104166666666668 | 0 |
| 0.9111111111111111 | 0 |
| 0.9118055555555555 | 0 |
| 0.9125 | 0 |
| 0.9131944444444445 | 0 |
| 0.9138888888888889 | 0 |
| 0.9145833333333333 | 0 |
| 0.9152777777777777 | 0 |
| 0.9159722222222223 | 0 |
| 0.9166666666666666 | 0 |
| 0.9173611111111111 | 0 |
| 0.9180555555555556 | 0 |
| 0.9187500000000001 | 0 |
| 0.9194444444444444 | 0 |
| 0.9201388888888888 | 0 |
| 0.9208333333333334 | 0 |
| 0.9215277777777778 | 0 |
| 0.9222222222222222 | 0 |
| 0.9229166666666666 | 0 |
| 0.9236111111111112 | 0 |
| 0.9243055555555556 | 0 |
| 0.9249999999999999 | 0 |
| 0.9256944444444444 | 0 |
| 0.9263888888888889 | 0 |
| 0.9270833333333334 | 0 |
| 0.9277777777777777 | 0 |
| 0.9284722222222223 | 0 |
| 0.9291666666666667 | 0 |
| 0.9298611111111111 | 0 |
| 0.9305555555555555 | 0 |
| 0.93125 | 0 |
| 0.9319444444444445 | 0 |
| 0.9326388888888889 | 0 |
| 0.9333333333333332 | 0 |
| 0.9340277777777778 | 0 |
| 0.9347222222222222 | 0 |
| 0.9354166666666667 | 0 |
| 0.936111111111111 | 0 |
| 0.9368055555555556 | 0 |
| 0.9375 | 0 |
| 0.9381944444444444 | 0 |
| 0.938888888888889 | 0 |
| 0.9395833333333333 | 0 |
| 0.9402777777777778 | 0 |
| 0.9409722222222222 | 0 |
| 0.9416666666666668 | 0 |
| 0.9423611111111111 | 0 |
| 0.9430555555555555 | 0 |
| 0.94375 | 0 |
| 0.9444444444444445 | 0 |
| 0.9451388888888889 | 0 |
| 0.9458333333333333 | 0 |
| 0.9465277777777777 | 0 |
| 0.9472222222222223 | 0 |
| 0.9479166666666666 | 0 |
| 0.9486111111111111 | 0 |
| 0.9493055555555556 | 0 |
| 0.9500000000000001 | 0 |
| 0.9506944444444444 | 0 |
| 0.9513888888888888 | 0 |
| 0.9520833333333334 | 0 |
| 0.9527777777777778 | 0 |
| 0.9534722222222222 | 0 |
| 0.9541666666666666 | 0 |
| 0.9548611111111112 | 0 |
| 0.9555555555555556 | 0 |
| 0.9562499999999999 | 0 |
| 0.9569444444444444 | 0 |
| 0.9576388888888889 | 0 |
| 0.9583333333333334 | 0 |
| 0.9590277777777777 | 0 |
| 0.9597222222222223 | 0 |
| 0.9604166666666667 | 0 |
| 0.9611111111111111 | 0 |
| 0.9618055555555555 | 0 |
| 0.9625 | 0 |
| 0.9631944444444445 | 0 |
| 0.9638888888888889 | 0 |
| 0.9645833333333332 | 0 |
| 0.9652777777777778 | 0 |
| 0.9659722222222222 | 0 |
| 0.9666666666666667 | 0 |
| 0.967361111111111 | 0 |
| 0.9680555555555556 | 0 |
| 0.96875 | 0 |
| 0.9694444444444444 | 0 |
| 0.970138888888889 | 0 |
| 0.9708333333333333 | 0 |
| 0.9715277777777778 | 0 |
| 0.9722222222222222 | 0 |
| 0.9729166666666668 | 0 |
| 0.9736111111111111 | 0 |
| 0.9743055555555555 | 0 |
| 0.975 | 0 |
| 0.9756944444444445 | 0 |
| 0.9763888888888889 | 0 |
| 0.9770833333333333 | 0 |
| 0.9777777777777777 | 0 |
| 0.9784722222222223 | 0 |
| 0.9791666666666666 | 0 |
| 0.9798611111111111 | 0 |
| 0.9805555555555556 | 0 |
| 0.9812500000000001 | 0 |
| 0.9819444444444444 | 0 |
| 0.9826388888888888 | 0 |
| 0.9833333333333334 | 0 |
| 0.9840277777777778 | 0 |
| 0.9847222222222222 | 0 |
| 0.9854166666666666 | 0 |
| 0.9861111111111112 | 0 |
| 0.9868055555555556 | 0 |
| 0.9874999999999999 | 0 |
| 0.9881944444444444 | 0 |
| 0.9888888888888889 | 0 |
| 0.9895833333333334 | 0 |
| 0.9902777777777777 | 0 |
| 0.9909722222222223 | 0 |
| 0.9916666666666667 | 0 |
| 0.9923611111111111 | 0 |
| 0.9930555555555555 | 0 |
| 0.99375 | 0 |
| 0.9944444444444445 | 0 |
| 0.9951388888888889 | 0 |
| 0.9958333333333332 | 0 |
| 0.9965277777777778 | 0 |
| 0.9972222222222222 | 0 |
| 0.9979166666666667 | 0 |
| 0.998611111111111 | 0 |
| 0.9993055555555556 | 0 |